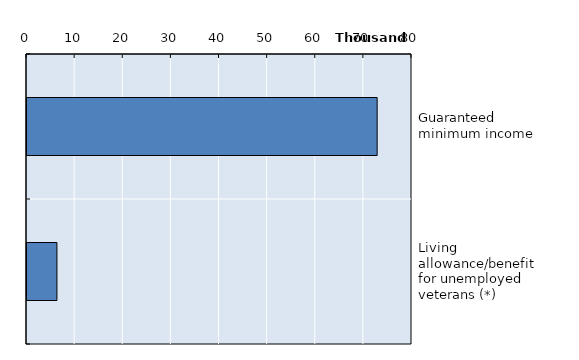
| Category | Series 0 |
|---|---|
| Guaranteed minimum income  | 72759 |
| Living allowance/benefit for unemployed veterans (*) | 6220 |